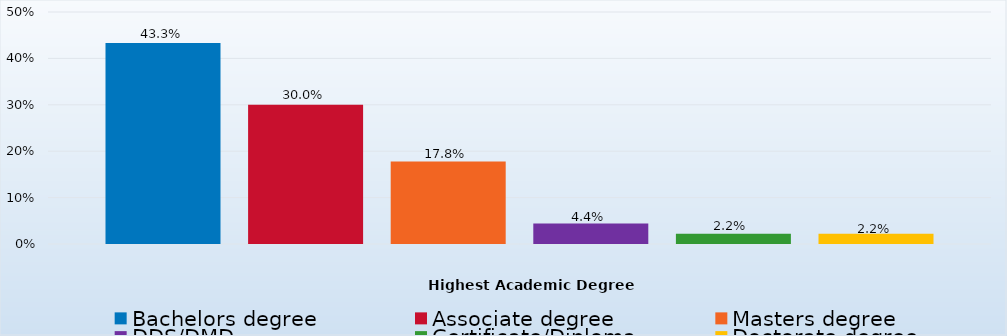
| Category | Bachelors degree | Associate degree | Masters degree | DDS/DMD | Certificate/Diploma | Doctorate degree |
|---|---|---|---|---|---|---|
| Percent | 0.433 | 0.3 | 0.178 | 0.044 | 0.022 | 0.022 |